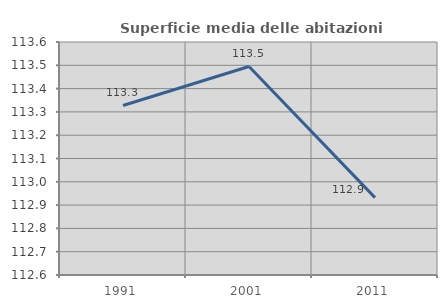
| Category | Superficie media delle abitazioni occupate |
|---|---|
| 1991.0 | 113.328 |
| 2001.0 | 113.495 |
| 2011.0 | 112.932 |